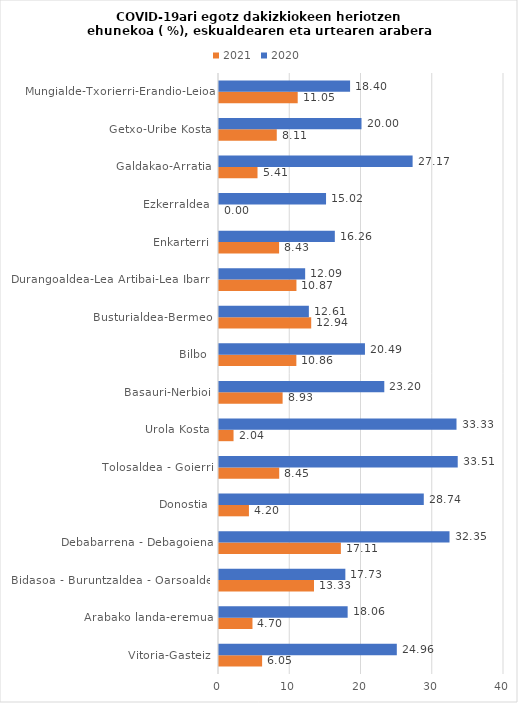
| Category | 2021 | 2020 |
|---|---|---|
| Vitoria-Gasteiz | 6.051 | 24.957 |
| Arabako landa-eremua | 4.698 | 18.056 |
| Bidasoa - Buruntzaldea - Oarsoaldea | 13.333 | 17.734 |
| Debabarrena - Debagoiena | 17.105 | 32.353 |
| Donostia | 4.202 | 28.743 |
| Tolosaldea - Goierri | 8.451 | 33.505 |
| Urola Kosta | 2.041 | 33.333 |
| Basauri-Nerbioi | 8.929 | 23.2 |
| Bilbo | 10.857 | 20.486 |
| Busturialdea-Bermeo | 12.941 | 12.613 |
| Durangoaldea-Lea Artibai-Lea Ibarra | 10.87 | 12.093 |
| Enkarterri | 8.434 | 16.256 |
| Ezkerraldea | 0 | 15.023 |
| Galdakao-Arratia | 5.405 | 27.174 |
| Getxo-Uribe Kosta | 8.108 | 20 |
| Mungialde-Txorierri-Erandio-Leioa | 11.047 | 18.396 |